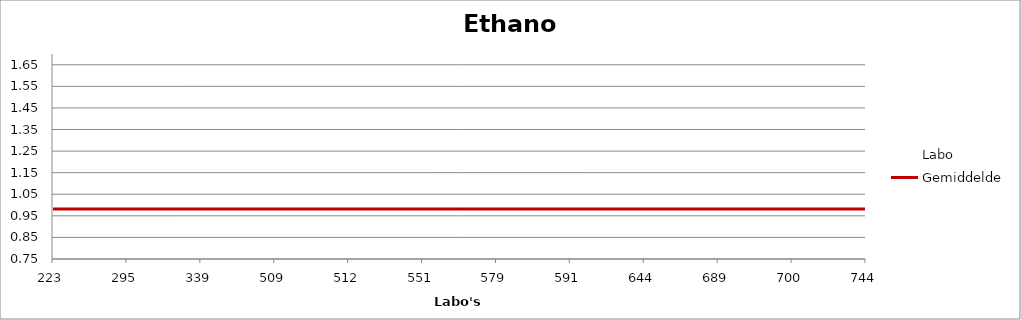
| Category | Labo | Gemiddelde |
|---|---|---|
| 223.0 | 1 | 0.982 |
| 295.0 | 0.909 | 0.982 |
| 339.0 | 0.933 | 0.982 |
| 509.0 | 1.1 | 0.982 |
| 512.0 | 0 | 0.982 |
| 551.0 | 0.964 | 0.982 |
| 579.0 | 1.03 | 0.982 |
| 591.0 | 0.994 | 0.982 |
| 644.0 | 0.867 | 0.982 |
| 689.0 | 0.927 | 0.982 |
| 700.0 | 0.966 | 0.982 |
| 744.0 | 1.679 | 0.982 |